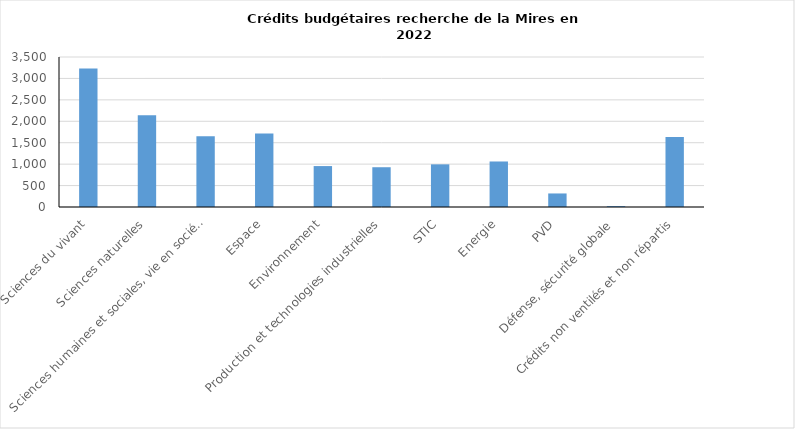
| Category | Series 0 |
|---|---|
| Sciences du vivant | 3229 |
| Sciences naturelles | 2141 |
| Sciences humaines et sociales, vie en société | 1653 |
| Espace | 1714 |
| Environnement | 955 |
| Production et technologies industrielles | 928 |
| STIC | 995 |
| Energie | 1062 |
| PVD | 316 |
| Défense, sécurité globale | 21 |
| Crédits non ventilés et non répartis | 1633 |